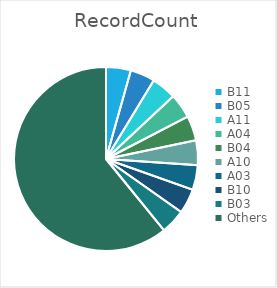
| Category | RecordCount |
|---|---|
| B11 | 0.043 |
| B05 | 0.043 |
| A11 | 0.043 |
| A04 | 0.043 |
| B04 | 0.043 |
| A10 | 0.043 |
| A03 | 0.043 |
| B10 | 0.043 |
| B03 | 0.043 |
| Others | 0.609 |